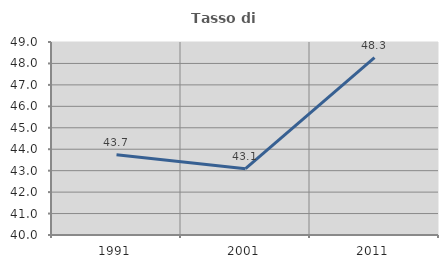
| Category | Tasso di occupazione   |
|---|---|
| 1991.0 | 43.744 |
| 2001.0 | 43.09 |
| 2011.0 | 48.273 |